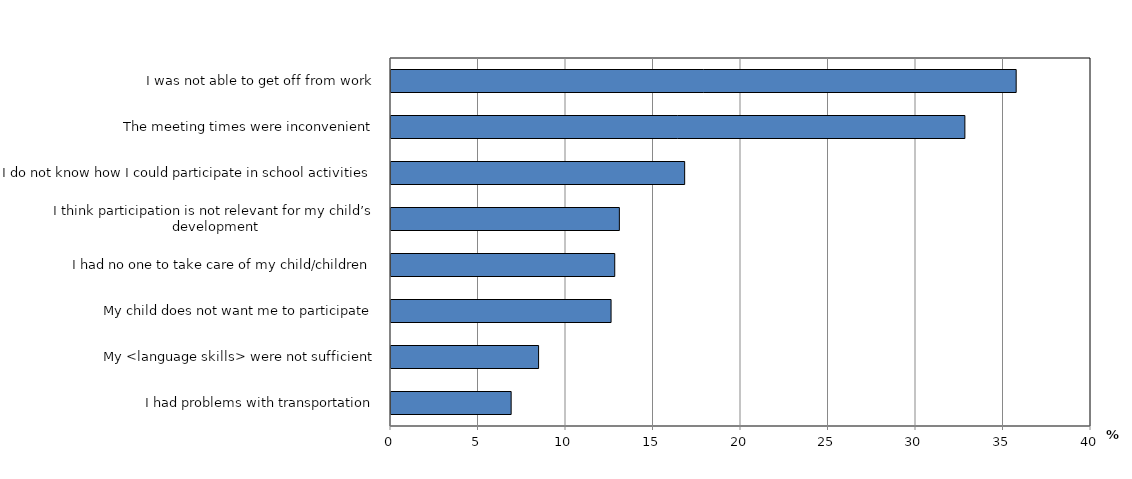
| Category | Series 0 |
|---|---|
| I had problems with transportation | 6.866 |
| My <language skills> were not sufficient | 8.434 |
| My child does not want me to participate | 12.576 |
| I had no one to take care of my child/children | 12.785 |
| I think participation is not relevant for my child’s development | 13.049 |
| I do not know how I could participate in school activities | 16.781 |
| The meeting times were inconvenient | 32.793 |
| I was not able to get off from work | 35.725 |